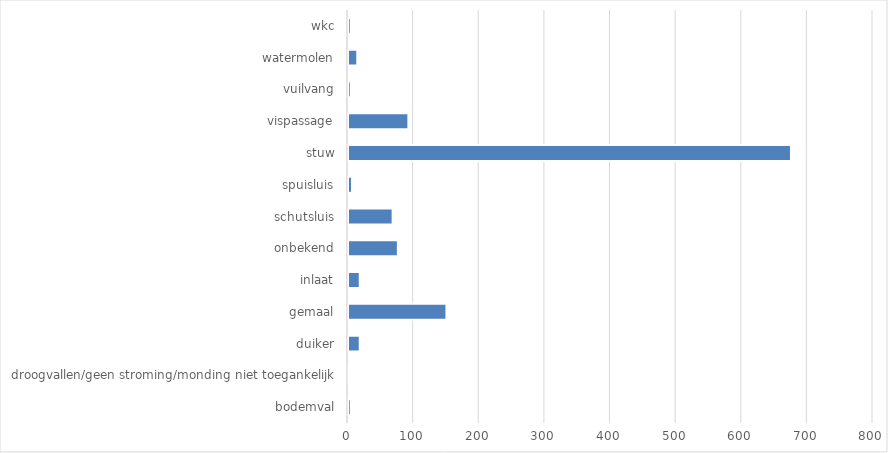
| Category | Series 0 |
|---|---|
| bodemval | 4 |
| droogvallen/geen stroming/monding niet toegankelijk | 2 |
| duiker | 18 |
| gemaal | 150 |
| inlaat | 18 |
| onbekend | 76 |
| schutsluis | 68 |
| spuisluis | 6 |
| stuw | 675 |
| vispassage | 92 |
| vuilvang | 4 |
| watermolen | 14 |
| wkc | 4 |